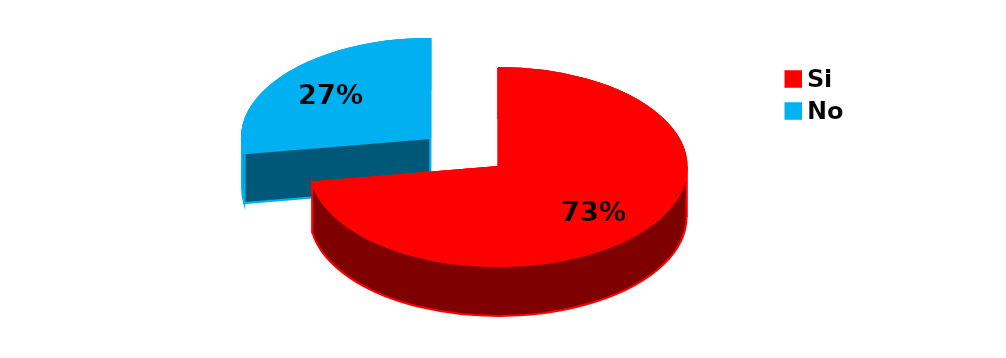
| Category | Series 0 |
|---|---|
| Si | 837 |
| No | 317 |